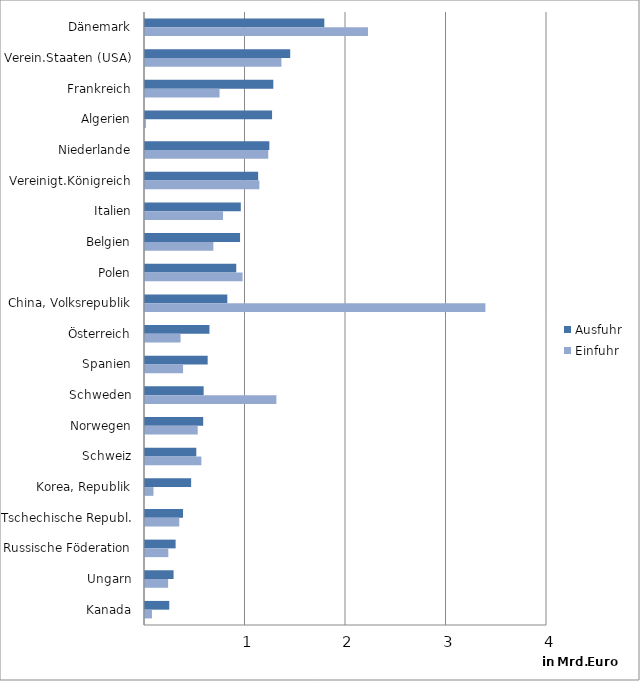
| Category | Ausfuhr | Einfuhr |
|---|---|---|
| Dänemark | 1.784 | 2.219 |
| Verein.Staaten (USA) | 1.445 | 1.358 |
| Frankreich | 1.277 | 0.742 |
| Algerien | 1.264 | 0.009 |
| Niederlande | 1.237 | 1.226 |
| Vereinigt.Königreich | 1.126 | 1.138 |
| Italien | 0.953 | 0.776 |
| Belgien | 0.946 | 0.68 |
| Polen | 0.908 | 0.971 |
| China, Volksrepublik | 0.819 | 3.387 |
| Österreich | 0.641 | 0.354 |
| Spanien | 0.624 | 0.379 |
| Schweden | 0.584 | 1.307 |
| Norwegen | 0.579 | 0.525 |
| Schweiz | 0.511 | 0.561 |
| Korea, Republik | 0.459 | 0.084 |
| Tschechische Republ. | 0.378 | 0.341 |
| Russische Föderation | 0.304 | 0.232 |
| Ungarn | 0.284 | 0.23 |
| Kanada | 0.241 | 0.069 |